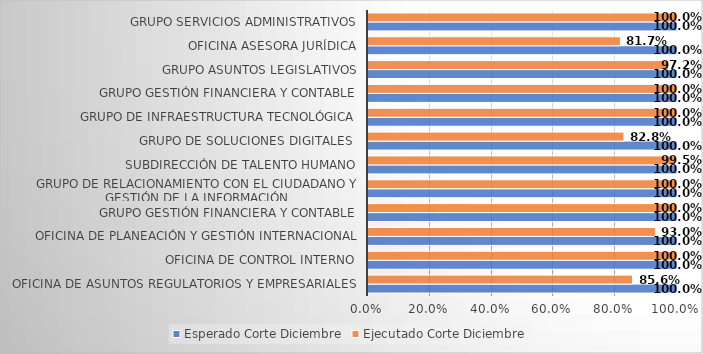
| Category | Esperado Corte Diciembre | Ejecutado Corte Diciembre |
|---|---|---|
| Oficina de Asuntos Regulatorios y Empresariales | 1 | 0.856 |
| Oficina de Control Interno | 1 | 1 |
| Oficina de Planeación y Gestión Internacional | 1 | 0.93 |
| Grupo Gestión Financiera y Contable | 1 | 1 |
| Grupo de Relacionamiento con el Ciudadano y Gestión de la Información | 1 | 1 |
| Subdirección de Talento Humano | 1 | 0.995 |
| Grupo de Soluciones Digitales  | 1 | 0.828 |
| Grupo de Infraestructura Tecnológica | 1 | 1 |
| Grupo Gestión Financiera y Contable | 1 | 1 |
| Grupo Asuntos Legislativos | 1 | 0.972 |
| Oficina Asesora Jurídica | 1 | 0.817 |
| Grupo Servicios Administrativos | 1 | 1 |